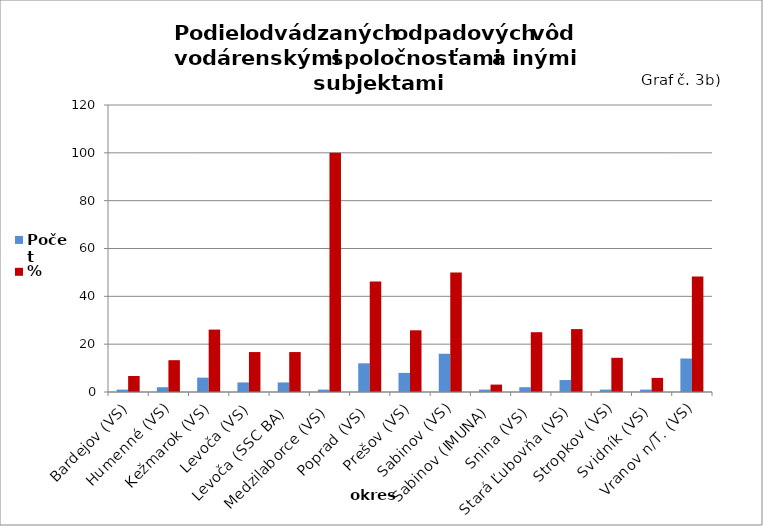
| Category | Počet | % |
|---|---|---|
| Bardejov (VS) | 1 | 6.7 |
| Humenné (VS) | 2 | 13.3 |
| Kežmarok (VS) | 6 | 26.1 |
| Levoča (VS) | 4 | 16.7 |
| Levoča (SSC BA) | 4 | 16.7 |
| Medzilaborce (VS) | 1 | 100 |
| Poprad (VS) | 12 | 46.2 |
| Prešov (VS) | 8 | 25.8 |
| Sabinov (VS) | 16 | 50 |
| Sabinov (IMUNA) | 1 | 3.1 |
| Snina (VS) | 2 | 25 |
| Stará Ľubovňa (VS) | 5 | 26.3 |
| Stropkov (VS) | 1 | 14.3 |
| Svidník (VS) | 1 | 5.9 |
| Vranov n/T. (VS) | 14 | 48.3 |